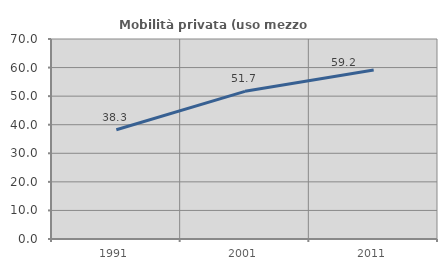
| Category | Mobilità privata (uso mezzo privato) |
|---|---|
| 1991.0 | 38.258 |
| 2001.0 | 51.68 |
| 2011.0 | 59.184 |